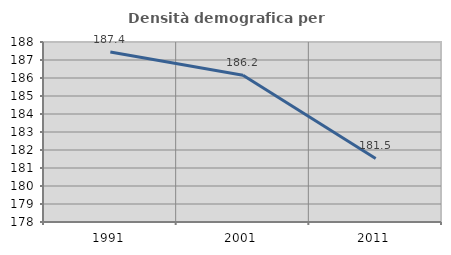
| Category | Densità demografica |
|---|---|
| 1991.0 | 187.442 |
| 2001.0 | 186.154 |
| 2011.0 | 181.531 |